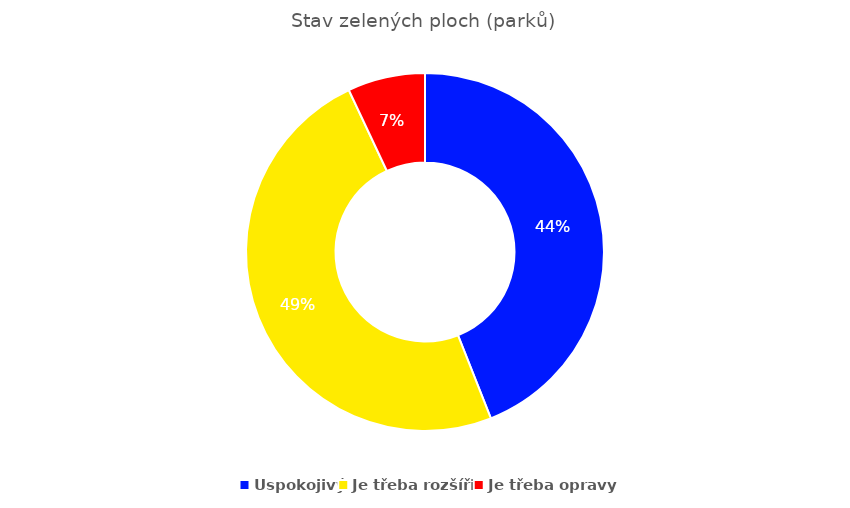
| Category | Zelených ploch (parků) |
|---|---|
| Uspokojivý | 0.44 |
| Je třeba rozšířit  | 0.49 |
| Je třeba opravy | 0.07 |